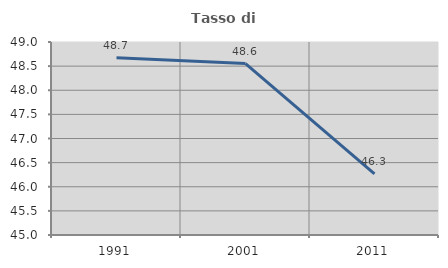
| Category | Tasso di occupazione   |
|---|---|
| 1991.0 | 48.675 |
| 2001.0 | 48.553 |
| 2011.0 | 46.269 |